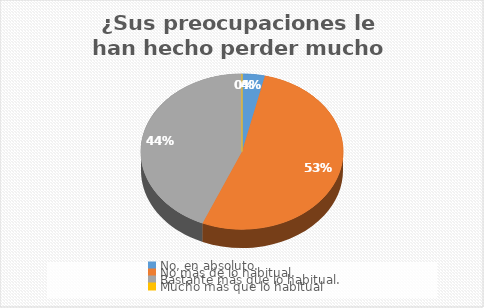
| Category | ¿Sus preocupaciones le han hecho perder mucho sueño? |
|---|---|
| No, en absoluto. | 4 |
| No más de lo habitual. | 58 |
| Bastante más que lo habitual. | 48 |
| Mucho más que lo habitual | 0 |